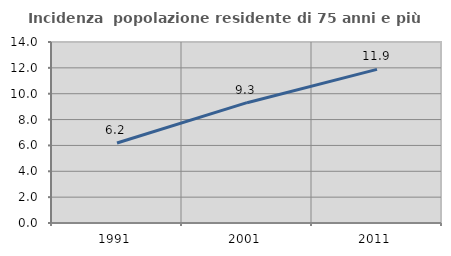
| Category | Incidenza  popolazione residente di 75 anni e più |
|---|---|
| 1991.0 | 6.188 |
| 2001.0 | 9.306 |
| 2011.0 | 11.885 |